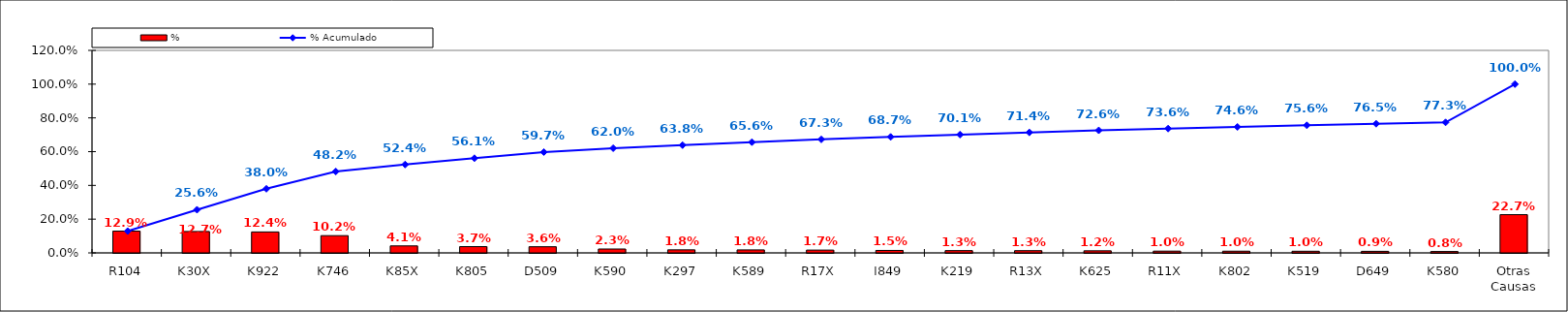
| Category | % |
|---|---|
| R104 | 0.129 |
| K30X | 0.127 |
| K922 | 0.124 |
| K746 | 0.102 |
| K85X | 0.041 |
| K805 | 0.037 |
| D509 | 0.036 |
| K590 | 0.023 |
| K297 | 0.018 |
| K589 | 0.018 |
| R17X | 0.017 |
| I849 | 0.015 |
| K219 | 0.013 |
| R13X | 0.013 |
| K625 | 0.012 |
| R11X | 0.01 |
| K802 | 0.01 |
| K519 | 0.01 |
| D649 | 0.009 |
| K580 | 0.008 |
| Otras Causas | 0.227 |